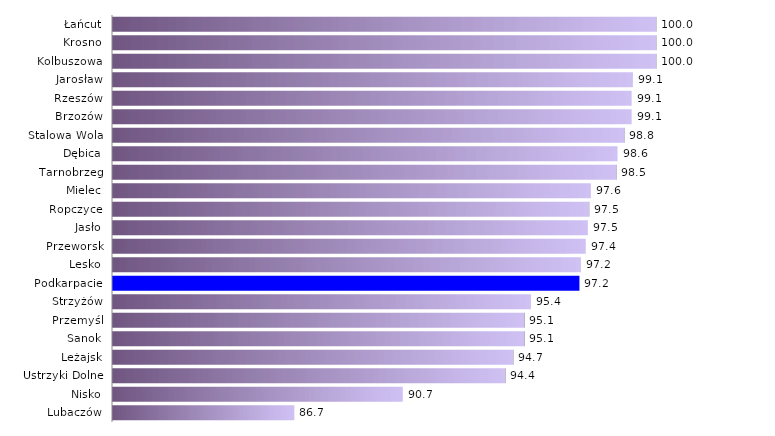
| Category | a |
|---|---|
| Lubaczów | 86.667 |
| Nisko | 90.667 |
| Ustrzyki Dolne | 94.444 |
| Leżajsk | 94.737 |
| Sanok | 95.146 |
| Przemyśl | 95.146 |
| Strzyżów | 95.385 |
| Podkarpacie | 97.169 |
| Lesko | 97.222 |
| Przeworsk | 97.403 |
| Jasło | 97.479 |
| Ropczyce | 97.531 |
| Mielec | 97.59 |
| Tarnobrzeg | 98.529 |
| Dębica | 98.571 |
| Stalowa Wola | 98.824 |
| Brzozów | 99.091 |
| Rzeszów | 99.091 |
| Jarosław | 99.138 |
| Kolbuszowa | 100 |
| Krosno | 100 |
| Łańcut | 100 |